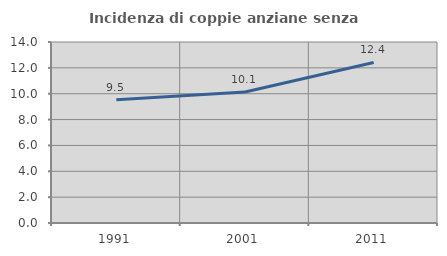
| Category | Incidenza di coppie anziane senza figli  |
|---|---|
| 1991.0 | 9.542 |
| 2001.0 | 10.135 |
| 2011.0 | 12.418 |